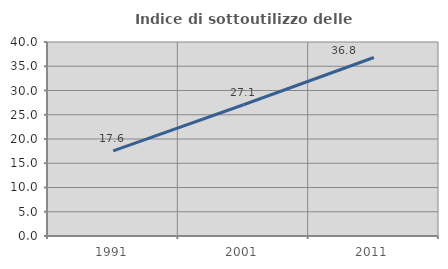
| Category | Indice di sottoutilizzo delle abitazioni  |
|---|---|
| 1991.0 | 17.568 |
| 2001.0 | 27.06 |
| 2011.0 | 36.801 |